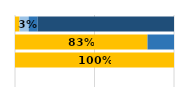
| Category | Niveles de desempeño | Series 1 | Series 2 | Series 3 |
|---|---|---|---|---|
| 0 | 0.029 | 0.057 | 0.057 | 0.857 |
| 1 | 0.833 | 0 | 0.167 | 0 |
| 2 | 1 | 0 | 0 | 0 |
| 3 | 0 | 0 | 0 | 0 |